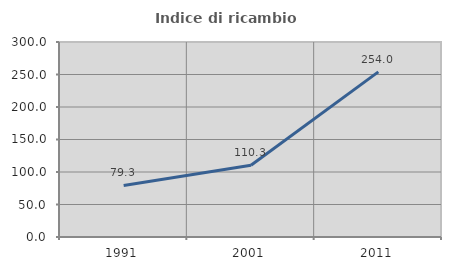
| Category | Indice di ricambio occupazionale  |
|---|---|
| 1991.0 | 79.324 |
| 2001.0 | 110.282 |
| 2011.0 | 254.043 |